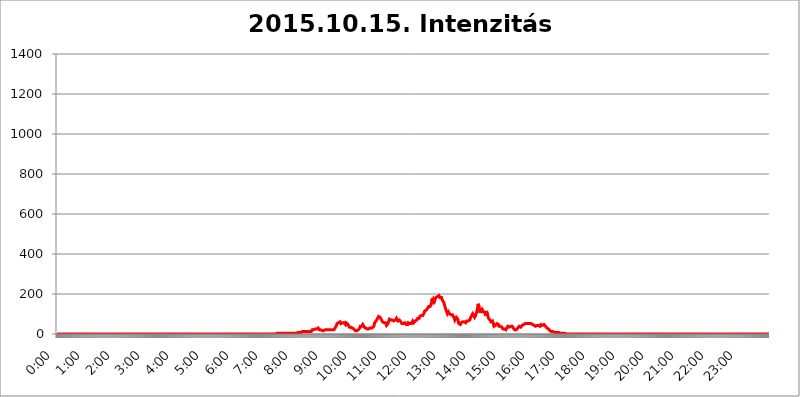
| Category | 2015.10.15. Intenzitás [W/m^2] |
|---|---|
| 0.0 | 0 |
| 0.0006944444444444445 | 0 |
| 0.001388888888888889 | 0 |
| 0.0020833333333333333 | 0 |
| 0.002777777777777778 | 0 |
| 0.003472222222222222 | 0 |
| 0.004166666666666667 | 0 |
| 0.004861111111111111 | 0 |
| 0.005555555555555556 | 0 |
| 0.0062499999999999995 | 0 |
| 0.006944444444444444 | 0 |
| 0.007638888888888889 | 0 |
| 0.008333333333333333 | 0 |
| 0.009027777777777779 | 0 |
| 0.009722222222222222 | 0 |
| 0.010416666666666666 | 0 |
| 0.011111111111111112 | 0 |
| 0.011805555555555555 | 0 |
| 0.012499999999999999 | 0 |
| 0.013194444444444444 | 0 |
| 0.013888888888888888 | 0 |
| 0.014583333333333332 | 0 |
| 0.015277777777777777 | 0 |
| 0.015972222222222224 | 0 |
| 0.016666666666666666 | 0 |
| 0.017361111111111112 | 0 |
| 0.018055555555555557 | 0 |
| 0.01875 | 0 |
| 0.019444444444444445 | 0 |
| 0.02013888888888889 | 0 |
| 0.020833333333333332 | 0 |
| 0.02152777777777778 | 0 |
| 0.022222222222222223 | 0 |
| 0.02291666666666667 | 0 |
| 0.02361111111111111 | 0 |
| 0.024305555555555556 | 0 |
| 0.024999999999999998 | 0 |
| 0.025694444444444447 | 0 |
| 0.02638888888888889 | 0 |
| 0.027083333333333334 | 0 |
| 0.027777777777777776 | 0 |
| 0.02847222222222222 | 0 |
| 0.029166666666666664 | 0 |
| 0.029861111111111113 | 0 |
| 0.030555555555555555 | 0 |
| 0.03125 | 0 |
| 0.03194444444444445 | 0 |
| 0.03263888888888889 | 0 |
| 0.03333333333333333 | 0 |
| 0.034027777777777775 | 0 |
| 0.034722222222222224 | 0 |
| 0.035416666666666666 | 0 |
| 0.036111111111111115 | 0 |
| 0.03680555555555556 | 0 |
| 0.0375 | 0 |
| 0.03819444444444444 | 0 |
| 0.03888888888888889 | 0 |
| 0.03958333333333333 | 0 |
| 0.04027777777777778 | 0 |
| 0.04097222222222222 | 0 |
| 0.041666666666666664 | 0 |
| 0.042361111111111106 | 0 |
| 0.04305555555555556 | 0 |
| 0.043750000000000004 | 0 |
| 0.044444444444444446 | 0 |
| 0.04513888888888889 | 0 |
| 0.04583333333333334 | 0 |
| 0.04652777777777778 | 0 |
| 0.04722222222222222 | 0 |
| 0.04791666666666666 | 0 |
| 0.04861111111111111 | 0 |
| 0.049305555555555554 | 0 |
| 0.049999999999999996 | 0 |
| 0.05069444444444445 | 0 |
| 0.051388888888888894 | 0 |
| 0.052083333333333336 | 0 |
| 0.05277777777777778 | 0 |
| 0.05347222222222222 | 0 |
| 0.05416666666666667 | 0 |
| 0.05486111111111111 | 0 |
| 0.05555555555555555 | 0 |
| 0.05625 | 0 |
| 0.05694444444444444 | 0 |
| 0.057638888888888885 | 0 |
| 0.05833333333333333 | 0 |
| 0.05902777777777778 | 0 |
| 0.059722222222222225 | 0 |
| 0.06041666666666667 | 0 |
| 0.061111111111111116 | 0 |
| 0.06180555555555556 | 0 |
| 0.0625 | 0 |
| 0.06319444444444444 | 0 |
| 0.06388888888888888 | 0 |
| 0.06458333333333334 | 0 |
| 0.06527777777777778 | 0 |
| 0.06597222222222222 | 0 |
| 0.06666666666666667 | 0 |
| 0.06736111111111111 | 0 |
| 0.06805555555555555 | 0 |
| 0.06874999999999999 | 0 |
| 0.06944444444444443 | 0 |
| 0.07013888888888889 | 0 |
| 0.07083333333333333 | 0 |
| 0.07152777777777779 | 0 |
| 0.07222222222222223 | 0 |
| 0.07291666666666667 | 0 |
| 0.07361111111111111 | 0 |
| 0.07430555555555556 | 0 |
| 0.075 | 0 |
| 0.07569444444444444 | 0 |
| 0.0763888888888889 | 0 |
| 0.07708333333333334 | 0 |
| 0.07777777777777778 | 0 |
| 0.07847222222222222 | 0 |
| 0.07916666666666666 | 0 |
| 0.0798611111111111 | 0 |
| 0.08055555555555556 | 0 |
| 0.08125 | 0 |
| 0.08194444444444444 | 0 |
| 0.08263888888888889 | 0 |
| 0.08333333333333333 | 0 |
| 0.08402777777777777 | 0 |
| 0.08472222222222221 | 0 |
| 0.08541666666666665 | 0 |
| 0.08611111111111112 | 0 |
| 0.08680555555555557 | 0 |
| 0.08750000000000001 | 0 |
| 0.08819444444444445 | 0 |
| 0.08888888888888889 | 0 |
| 0.08958333333333333 | 0 |
| 0.09027777777777778 | 0 |
| 0.09097222222222222 | 0 |
| 0.09166666666666667 | 0 |
| 0.09236111111111112 | 0 |
| 0.09305555555555556 | 0 |
| 0.09375 | 0 |
| 0.09444444444444444 | 0 |
| 0.09513888888888888 | 0 |
| 0.09583333333333333 | 0 |
| 0.09652777777777777 | 0 |
| 0.09722222222222222 | 0 |
| 0.09791666666666667 | 0 |
| 0.09861111111111111 | 0 |
| 0.09930555555555555 | 0 |
| 0.09999999999999999 | 0 |
| 0.10069444444444443 | 0 |
| 0.1013888888888889 | 0 |
| 0.10208333333333335 | 0 |
| 0.10277777777777779 | 0 |
| 0.10347222222222223 | 0 |
| 0.10416666666666667 | 0 |
| 0.10486111111111111 | 0 |
| 0.10555555555555556 | 0 |
| 0.10625 | 0 |
| 0.10694444444444444 | 0 |
| 0.1076388888888889 | 0 |
| 0.10833333333333334 | 0 |
| 0.10902777777777778 | 0 |
| 0.10972222222222222 | 0 |
| 0.1111111111111111 | 0 |
| 0.11180555555555556 | 0 |
| 0.11180555555555556 | 0 |
| 0.1125 | 0 |
| 0.11319444444444444 | 0 |
| 0.11388888888888889 | 0 |
| 0.11458333333333333 | 0 |
| 0.11527777777777777 | 0 |
| 0.11597222222222221 | 0 |
| 0.11666666666666665 | 0 |
| 0.1173611111111111 | 0 |
| 0.11805555555555557 | 0 |
| 0.11944444444444445 | 0 |
| 0.12013888888888889 | 0 |
| 0.12083333333333333 | 0 |
| 0.12152777777777778 | 0 |
| 0.12222222222222223 | 0 |
| 0.12291666666666667 | 0 |
| 0.12291666666666667 | 0 |
| 0.12361111111111112 | 0 |
| 0.12430555555555556 | 0 |
| 0.125 | 0 |
| 0.12569444444444444 | 0 |
| 0.12638888888888888 | 0 |
| 0.12708333333333333 | 0 |
| 0.16875 | 0 |
| 0.12847222222222224 | 0 |
| 0.12916666666666668 | 0 |
| 0.12986111111111112 | 0 |
| 0.13055555555555556 | 0 |
| 0.13125 | 0 |
| 0.13194444444444445 | 0 |
| 0.1326388888888889 | 0 |
| 0.13333333333333333 | 0 |
| 0.13402777777777777 | 0 |
| 0.13402777777777777 | 0 |
| 0.13472222222222222 | 0 |
| 0.13541666666666666 | 0 |
| 0.1361111111111111 | 0 |
| 0.13749999999999998 | 0 |
| 0.13819444444444443 | 0 |
| 0.1388888888888889 | 0 |
| 0.13958333333333334 | 0 |
| 0.14027777777777778 | 0 |
| 0.14097222222222222 | 0 |
| 0.14166666666666666 | 0 |
| 0.1423611111111111 | 0 |
| 0.14305555555555557 | 0 |
| 0.14375000000000002 | 0 |
| 0.14444444444444446 | 0 |
| 0.1451388888888889 | 0 |
| 0.1451388888888889 | 0 |
| 0.14652777777777778 | 0 |
| 0.14722222222222223 | 0 |
| 0.14791666666666667 | 0 |
| 0.1486111111111111 | 0 |
| 0.14930555555555555 | 0 |
| 0.15 | 0 |
| 0.15069444444444444 | 0 |
| 0.15138888888888888 | 0 |
| 0.15208333333333332 | 0 |
| 0.15277777777777776 | 0 |
| 0.15347222222222223 | 0 |
| 0.15416666666666667 | 0 |
| 0.15486111111111112 | 0 |
| 0.15555555555555556 | 0 |
| 0.15625 | 0 |
| 0.15694444444444444 | 0 |
| 0.15763888888888888 | 0 |
| 0.15833333333333333 | 0 |
| 0.15902777777777777 | 0 |
| 0.15972222222222224 | 0 |
| 0.16041666666666668 | 0 |
| 0.16111111111111112 | 0 |
| 0.16180555555555556 | 0 |
| 0.1625 | 0 |
| 0.16319444444444445 | 0 |
| 0.1638888888888889 | 0 |
| 0.16458333333333333 | 0 |
| 0.16527777777777777 | 0 |
| 0.16597222222222222 | 0 |
| 0.16666666666666666 | 0 |
| 0.1673611111111111 | 0 |
| 0.16805555555555554 | 0 |
| 0.16874999999999998 | 0 |
| 0.16944444444444443 | 0 |
| 0.17013888888888887 | 0 |
| 0.1708333333333333 | 0 |
| 0.17152777777777775 | 0 |
| 0.17222222222222225 | 0 |
| 0.1729166666666667 | 0 |
| 0.17361111111111113 | 0 |
| 0.17430555555555557 | 0 |
| 0.17500000000000002 | 0 |
| 0.17569444444444446 | 0 |
| 0.1763888888888889 | 0 |
| 0.17708333333333334 | 0 |
| 0.17777777777777778 | 0 |
| 0.17847222222222223 | 0 |
| 0.17916666666666667 | 0 |
| 0.1798611111111111 | 0 |
| 0.18055555555555555 | 0 |
| 0.18125 | 0 |
| 0.18194444444444444 | 0 |
| 0.1826388888888889 | 0 |
| 0.18333333333333335 | 0 |
| 0.1840277777777778 | 0 |
| 0.18472222222222223 | 0 |
| 0.18541666666666667 | 0 |
| 0.18611111111111112 | 0 |
| 0.18680555555555556 | 0 |
| 0.1875 | 0 |
| 0.18819444444444444 | 0 |
| 0.18888888888888888 | 0 |
| 0.18958333333333333 | 0 |
| 0.19027777777777777 | 0 |
| 0.1909722222222222 | 0 |
| 0.19166666666666665 | 0 |
| 0.19236111111111112 | 0 |
| 0.19305555555555554 | 0 |
| 0.19375 | 0 |
| 0.19444444444444445 | 0 |
| 0.1951388888888889 | 0 |
| 0.19583333333333333 | 0 |
| 0.19652777777777777 | 0 |
| 0.19722222222222222 | 0 |
| 0.19791666666666666 | 0 |
| 0.1986111111111111 | 0 |
| 0.19930555555555554 | 0 |
| 0.19999999999999998 | 0 |
| 0.20069444444444443 | 0 |
| 0.20138888888888887 | 0 |
| 0.2020833333333333 | 0 |
| 0.2027777777777778 | 0 |
| 0.2034722222222222 | 0 |
| 0.2041666666666667 | 0 |
| 0.20486111111111113 | 0 |
| 0.20555555555555557 | 0 |
| 0.20625000000000002 | 0 |
| 0.20694444444444446 | 0 |
| 0.2076388888888889 | 0 |
| 0.20833333333333334 | 0 |
| 0.20902777777777778 | 0 |
| 0.20972222222222223 | 0 |
| 0.21041666666666667 | 0 |
| 0.2111111111111111 | 0 |
| 0.21180555555555555 | 0 |
| 0.2125 | 0 |
| 0.21319444444444444 | 0 |
| 0.2138888888888889 | 0 |
| 0.21458333333333335 | 0 |
| 0.2152777777777778 | 0 |
| 0.21597222222222223 | 0 |
| 0.21666666666666667 | 0 |
| 0.21736111111111112 | 0 |
| 0.21805555555555556 | 0 |
| 0.21875 | 0 |
| 0.21944444444444444 | 0 |
| 0.22013888888888888 | 0 |
| 0.22083333333333333 | 0 |
| 0.22152777777777777 | 0 |
| 0.2222222222222222 | 0 |
| 0.22291666666666665 | 0 |
| 0.2236111111111111 | 0 |
| 0.22430555555555556 | 0 |
| 0.225 | 0 |
| 0.22569444444444445 | 0 |
| 0.2263888888888889 | 0 |
| 0.22708333333333333 | 0 |
| 0.22777777777777777 | 0 |
| 0.22847222222222222 | 0 |
| 0.22916666666666666 | 0 |
| 0.2298611111111111 | 0 |
| 0.23055555555555554 | 0 |
| 0.23124999999999998 | 0 |
| 0.23194444444444443 | 0 |
| 0.23263888888888887 | 0 |
| 0.2333333333333333 | 0 |
| 0.2340277777777778 | 0 |
| 0.2347222222222222 | 0 |
| 0.2354166666666667 | 0 |
| 0.23611111111111113 | 0 |
| 0.23680555555555557 | 0 |
| 0.23750000000000002 | 0 |
| 0.23819444444444446 | 0 |
| 0.2388888888888889 | 0 |
| 0.23958333333333334 | 0 |
| 0.24027777777777778 | 0 |
| 0.24097222222222223 | 0 |
| 0.24166666666666667 | 0 |
| 0.2423611111111111 | 0 |
| 0.24305555555555555 | 0 |
| 0.24375 | 0 |
| 0.24444444444444446 | 0 |
| 0.24513888888888888 | 0 |
| 0.24583333333333335 | 0 |
| 0.2465277777777778 | 0 |
| 0.24722222222222223 | 0 |
| 0.24791666666666667 | 0 |
| 0.24861111111111112 | 0 |
| 0.24930555555555556 | 0 |
| 0.25 | 0 |
| 0.25069444444444444 | 0 |
| 0.2513888888888889 | 0 |
| 0.2520833333333333 | 0 |
| 0.25277777777777777 | 0 |
| 0.2534722222222222 | 0 |
| 0.25416666666666665 | 0 |
| 0.2548611111111111 | 0 |
| 0.2555555555555556 | 0 |
| 0.25625000000000003 | 0 |
| 0.2569444444444445 | 0 |
| 0.2576388888888889 | 0 |
| 0.25833333333333336 | 0 |
| 0.2590277777777778 | 0 |
| 0.25972222222222224 | 0 |
| 0.2604166666666667 | 0 |
| 0.2611111111111111 | 0 |
| 0.26180555555555557 | 0 |
| 0.2625 | 0 |
| 0.26319444444444445 | 0 |
| 0.2638888888888889 | 0 |
| 0.26458333333333334 | 0 |
| 0.2652777777777778 | 0 |
| 0.2659722222222222 | 0 |
| 0.26666666666666666 | 0 |
| 0.2673611111111111 | 0 |
| 0.26805555555555555 | 0 |
| 0.26875 | 0 |
| 0.26944444444444443 | 0 |
| 0.2701388888888889 | 0 |
| 0.2708333333333333 | 0 |
| 0.27152777777777776 | 0 |
| 0.2722222222222222 | 0 |
| 0.27291666666666664 | 0 |
| 0.2736111111111111 | 0 |
| 0.2743055555555555 | 0 |
| 0.27499999999999997 | 0 |
| 0.27569444444444446 | 0 |
| 0.27638888888888885 | 0 |
| 0.27708333333333335 | 0 |
| 0.2777777777777778 | 0 |
| 0.27847222222222223 | 0 |
| 0.2791666666666667 | 0 |
| 0.2798611111111111 | 0 |
| 0.28055555555555556 | 0 |
| 0.28125 | 0 |
| 0.28194444444444444 | 0 |
| 0.2826388888888889 | 0 |
| 0.2833333333333333 | 0 |
| 0.28402777777777777 | 0 |
| 0.2847222222222222 | 0 |
| 0.28541666666666665 | 0 |
| 0.28611111111111115 | 0 |
| 0.28680555555555554 | 0 |
| 0.28750000000000003 | 0 |
| 0.2881944444444445 | 0 |
| 0.2888888888888889 | 0 |
| 0.28958333333333336 | 0 |
| 0.2902777777777778 | 0 |
| 0.29097222222222224 | 0 |
| 0.2916666666666667 | 0 |
| 0.2923611111111111 | 0 |
| 0.29305555555555557 | 0 |
| 0.29375 | 0 |
| 0.29444444444444445 | 0 |
| 0.2951388888888889 | 0 |
| 0.29583333333333334 | 0 |
| 0.2965277777777778 | 0 |
| 0.2972222222222222 | 0 |
| 0.29791666666666666 | 0 |
| 0.2986111111111111 | 0 |
| 0.29930555555555555 | 0 |
| 0.3 | 0 |
| 0.30069444444444443 | 0 |
| 0.3013888888888889 | 0 |
| 0.3020833333333333 | 0 |
| 0.30277777777777776 | 0 |
| 0.3034722222222222 | 0 |
| 0.30416666666666664 | 0 |
| 0.3048611111111111 | 0 |
| 0.3055555555555555 | 0 |
| 0.30624999999999997 | 0 |
| 0.3069444444444444 | 0 |
| 0.3076388888888889 | 0 |
| 0.30833333333333335 | 3.525 |
| 0.3090277777777778 | 3.525 |
| 0.30972222222222223 | 3.525 |
| 0.3104166666666667 | 3.525 |
| 0.3111111111111111 | 3.525 |
| 0.31180555555555556 | 3.525 |
| 0.3125 | 3.525 |
| 0.31319444444444444 | 3.525 |
| 0.3138888888888889 | 3.525 |
| 0.3145833333333333 | 3.525 |
| 0.31527777777777777 | 3.525 |
| 0.3159722222222222 | 3.525 |
| 0.31666666666666665 | 3.525 |
| 0.31736111111111115 | 3.525 |
| 0.31805555555555554 | 3.525 |
| 0.31875000000000003 | 3.525 |
| 0.3194444444444445 | 3.525 |
| 0.3201388888888889 | 3.525 |
| 0.32083333333333336 | 3.525 |
| 0.3215277777777778 | 3.525 |
| 0.32222222222222224 | 3.525 |
| 0.3229166666666667 | 3.525 |
| 0.3236111111111111 | 3.525 |
| 0.32430555555555557 | 3.525 |
| 0.325 | 3.525 |
| 0.32569444444444445 | 3.525 |
| 0.3263888888888889 | 3.525 |
| 0.32708333333333334 | 3.525 |
| 0.3277777777777778 | 3.525 |
| 0.3284722222222222 | 3.525 |
| 0.32916666666666666 | 3.525 |
| 0.3298611111111111 | 3.525 |
| 0.33055555555555555 | 3.525 |
| 0.33125 | 3.525 |
| 0.33194444444444443 | 3.525 |
| 0.3326388888888889 | 3.525 |
| 0.3333333333333333 | 3.525 |
| 0.3340277777777778 | 3.525 |
| 0.3347222222222222 | 3.525 |
| 0.3354166666666667 | 3.525 |
| 0.3361111111111111 | 3.525 |
| 0.3368055555555556 | 7.887 |
| 0.33749999999999997 | 7.887 |
| 0.33819444444444446 | 7.887 |
| 0.33888888888888885 | 7.887 |
| 0.33958333333333335 | 7.887 |
| 0.34027777777777773 | 7.887 |
| 0.34097222222222223 | 7.887 |
| 0.3416666666666666 | 7.887 |
| 0.3423611111111111 | 7.887 |
| 0.3430555555555555 | 7.887 |
| 0.34375 | 12.257 |
| 0.3444444444444445 | 12.257 |
| 0.3451388888888889 | 12.257 |
| 0.3458333333333334 | 12.257 |
| 0.34652777777777777 | 12.257 |
| 0.34722222222222227 | 12.257 |
| 0.34791666666666665 | 12.257 |
| 0.34861111111111115 | 12.257 |
| 0.34930555555555554 | 12.257 |
| 0.35000000000000003 | 12.257 |
| 0.3506944444444444 | 12.257 |
| 0.3513888888888889 | 12.257 |
| 0.3520833333333333 | 12.257 |
| 0.3527777777777778 | 12.257 |
| 0.3534722222222222 | 12.257 |
| 0.3541666666666667 | 12.257 |
| 0.3548611111111111 | 12.257 |
| 0.35555555555555557 | 12.257 |
| 0.35625 | 12.257 |
| 0.35694444444444445 | 16.636 |
| 0.3576388888888889 | 21.024 |
| 0.35833333333333334 | 21.024 |
| 0.3590277777777778 | 21.024 |
| 0.3597222222222222 | 21.024 |
| 0.36041666666666666 | 21.024 |
| 0.3611111111111111 | 25.419 |
| 0.36180555555555555 | 25.419 |
| 0.3625 | 25.419 |
| 0.36319444444444443 | 25.419 |
| 0.3638888888888889 | 25.419 |
| 0.3645833333333333 | 25.419 |
| 0.3652777777777778 | 29.823 |
| 0.3659722222222222 | 29.823 |
| 0.3666666666666667 | 25.419 |
| 0.3673611111111111 | 21.024 |
| 0.3680555555555556 | 21.024 |
| 0.36874999999999997 | 21.024 |
| 0.36944444444444446 | 21.024 |
| 0.37013888888888885 | 21.024 |
| 0.37083333333333335 | 16.636 |
| 0.37152777777777773 | 16.636 |
| 0.37222222222222223 | 16.636 |
| 0.3729166666666666 | 16.636 |
| 0.3736111111111111 | 16.636 |
| 0.3743055555555555 | 21.024 |
| 0.375 | 21.024 |
| 0.3756944444444445 | 21.024 |
| 0.3763888888888889 | 21.024 |
| 0.3770833333333334 | 21.024 |
| 0.37777777777777777 | 21.024 |
| 0.37847222222222227 | 21.024 |
| 0.37916666666666665 | 21.024 |
| 0.37986111111111115 | 21.024 |
| 0.38055555555555554 | 21.024 |
| 0.38125000000000003 | 21.024 |
| 0.3819444444444444 | 21.024 |
| 0.3826388888888889 | 21.024 |
| 0.3833333333333333 | 21.024 |
| 0.3840277777777778 | 21.024 |
| 0.3847222222222222 | 21.024 |
| 0.3854166666666667 | 21.024 |
| 0.3861111111111111 | 21.024 |
| 0.38680555555555557 | 21.024 |
| 0.3875 | 21.024 |
| 0.38819444444444445 | 21.024 |
| 0.3888888888888889 | 25.419 |
| 0.38958333333333334 | 29.823 |
| 0.3902777777777778 | 29.823 |
| 0.3909722222222222 | 34.234 |
| 0.39166666666666666 | 43.079 |
| 0.3923611111111111 | 51.951 |
| 0.39305555555555555 | 56.398 |
| 0.39375 | 56.398 |
| 0.39444444444444443 | 56.398 |
| 0.3951388888888889 | 56.398 |
| 0.3958333333333333 | 56.398 |
| 0.3965277777777778 | 60.85 |
| 0.3972222222222222 | 56.398 |
| 0.3979166666666667 | 51.951 |
| 0.3986111111111111 | 56.398 |
| 0.3993055555555556 | 56.398 |
| 0.39999999999999997 | 56.398 |
| 0.40069444444444446 | 51.951 |
| 0.40138888888888885 | 56.398 |
| 0.40208333333333335 | 56.398 |
| 0.40277777777777773 | 60.85 |
| 0.40347222222222223 | 51.951 |
| 0.4041666666666666 | 47.511 |
| 0.4048611111111111 | 56.398 |
| 0.4055555555555555 | 56.398 |
| 0.40625 | 51.951 |
| 0.4069444444444445 | 51.951 |
| 0.4076388888888889 | 47.511 |
| 0.4083333333333334 | 43.079 |
| 0.40902777777777777 | 38.653 |
| 0.40972222222222227 | 34.234 |
| 0.41041666666666665 | 34.234 |
| 0.41111111111111115 | 38.653 |
| 0.41180555555555554 | 34.234 |
| 0.41250000000000003 | 34.234 |
| 0.4131944444444444 | 29.823 |
| 0.4138888888888889 | 29.823 |
| 0.4145833333333333 | 25.419 |
| 0.4152777777777778 | 25.419 |
| 0.4159722222222222 | 25.419 |
| 0.4166666666666667 | 25.419 |
| 0.4173611111111111 | 21.024 |
| 0.41805555555555557 | 16.636 |
| 0.41875 | 16.636 |
| 0.41944444444444445 | 16.636 |
| 0.4201388888888889 | 16.636 |
| 0.42083333333333334 | 16.636 |
| 0.4215277777777778 | 16.636 |
| 0.4222222222222222 | 21.024 |
| 0.42291666666666666 | 21.024 |
| 0.4236111111111111 | 25.419 |
| 0.42430555555555555 | 29.823 |
| 0.425 | 38.653 |
| 0.42569444444444443 | 43.079 |
| 0.4263888888888889 | 38.653 |
| 0.4270833333333333 | 38.653 |
| 0.4277777777777778 | 43.079 |
| 0.4284722222222222 | 47.511 |
| 0.4291666666666667 | 47.511 |
| 0.4298611111111111 | 43.079 |
| 0.4305555555555556 | 34.234 |
| 0.43124999999999997 | 29.823 |
| 0.43194444444444446 | 29.823 |
| 0.43263888888888885 | 29.823 |
| 0.43333333333333335 | 29.823 |
| 0.43402777777777773 | 25.419 |
| 0.43472222222222223 | 25.419 |
| 0.4354166666666666 | 25.419 |
| 0.4361111111111111 | 25.419 |
| 0.4368055555555555 | 25.419 |
| 0.4375 | 29.823 |
| 0.4381944444444445 | 29.823 |
| 0.4388888888888889 | 29.823 |
| 0.4395833333333334 | 29.823 |
| 0.44027777777777777 | 29.823 |
| 0.44097222222222227 | 29.823 |
| 0.44166666666666665 | 29.823 |
| 0.44236111111111115 | 34.234 |
| 0.44305555555555554 | 34.234 |
| 0.44375000000000003 | 38.653 |
| 0.4444444444444444 | 43.079 |
| 0.4451388888888889 | 56.398 |
| 0.4458333333333333 | 56.398 |
| 0.4465277777777778 | 56.398 |
| 0.4472222222222222 | 65.31 |
| 0.4479166666666667 | 69.775 |
| 0.4486111111111111 | 74.246 |
| 0.44930555555555557 | 74.246 |
| 0.45 | 78.722 |
| 0.45069444444444445 | 87.692 |
| 0.4513888888888889 | 83.205 |
| 0.45208333333333334 | 83.205 |
| 0.4527777777777778 | 83.205 |
| 0.4534722222222222 | 83.205 |
| 0.45416666666666666 | 74.246 |
| 0.4548611111111111 | 74.246 |
| 0.45555555555555555 | 69.775 |
| 0.45625 | 60.85 |
| 0.45694444444444443 | 56.398 |
| 0.4576388888888889 | 56.398 |
| 0.4583333333333333 | 56.398 |
| 0.4590277777777778 | 51.951 |
| 0.4597222222222222 | 51.951 |
| 0.4604166666666667 | 56.398 |
| 0.4611111111111111 | 51.951 |
| 0.4618055555555556 | 43.079 |
| 0.46249999999999997 | 47.511 |
| 0.46319444444444446 | 47.511 |
| 0.46388888888888885 | 51.951 |
| 0.46458333333333335 | 60.85 |
| 0.46527777777777773 | 65.31 |
| 0.46597222222222223 | 74.246 |
| 0.4666666666666666 | 74.246 |
| 0.4673611111111111 | 74.246 |
| 0.4680555555555555 | 69.775 |
| 0.46875 | 69.775 |
| 0.4694444444444445 | 65.31 |
| 0.4701388888888889 | 69.775 |
| 0.4708333333333334 | 69.775 |
| 0.47152777777777777 | 69.775 |
| 0.47222222222222227 | 65.31 |
| 0.47291666666666665 | 65.31 |
| 0.47361111111111115 | 65.31 |
| 0.47430555555555554 | 69.775 |
| 0.47500000000000003 | 74.246 |
| 0.4756944444444444 | 78.722 |
| 0.4763888888888889 | 78.722 |
| 0.4770833333333333 | 74.246 |
| 0.4777777777777778 | 65.31 |
| 0.4784722222222222 | 65.31 |
| 0.4791666666666667 | 69.775 |
| 0.4798611111111111 | 69.775 |
| 0.48055555555555557 | 65.31 |
| 0.48125 | 65.31 |
| 0.48194444444444445 | 60.85 |
| 0.4826388888888889 | 56.398 |
| 0.48333333333333334 | 51.951 |
| 0.4840277777777778 | 51.951 |
| 0.4847222222222222 | 56.398 |
| 0.48541666666666666 | 51.951 |
| 0.4861111111111111 | 51.951 |
| 0.48680555555555555 | 56.398 |
| 0.4875 | 56.398 |
| 0.48819444444444443 | 60.85 |
| 0.4888888888888889 | 56.398 |
| 0.4895833333333333 | 47.511 |
| 0.4902777777777778 | 47.511 |
| 0.4909722222222222 | 47.511 |
| 0.4916666666666667 | 47.511 |
| 0.4923611111111111 | 56.398 |
| 0.4930555555555556 | 60.85 |
| 0.49374999999999997 | 56.398 |
| 0.49444444444444446 | 51.951 |
| 0.49513888888888885 | 47.511 |
| 0.49583333333333335 | 47.511 |
| 0.49652777777777773 | 51.951 |
| 0.49722222222222223 | 56.398 |
| 0.4979166666666666 | 56.398 |
| 0.4986111111111111 | 65.31 |
| 0.4993055555555555 | 60.85 |
| 0.5 | 56.398 |
| 0.5006944444444444 | 60.85 |
| 0.5013888888888889 | 60.85 |
| 0.5020833333333333 | 65.31 |
| 0.5027777777777778 | 65.31 |
| 0.5034722222222222 | 65.31 |
| 0.5041666666666667 | 69.775 |
| 0.5048611111111111 | 74.246 |
| 0.5055555555555555 | 78.722 |
| 0.50625 | 74.246 |
| 0.5069444444444444 | 74.246 |
| 0.5076388888888889 | 78.722 |
| 0.5083333333333333 | 87.692 |
| 0.5090277777777777 | 87.692 |
| 0.5097222222222222 | 87.692 |
| 0.5104166666666666 | 92.184 |
| 0.5111111111111112 | 96.682 |
| 0.5118055555555555 | 92.184 |
| 0.5125000000000001 | 92.184 |
| 0.5131944444444444 | 87.692 |
| 0.513888888888889 | 96.682 |
| 0.5145833333333333 | 105.69 |
| 0.5152777777777778 | 114.716 |
| 0.5159722222222222 | 114.716 |
| 0.5166666666666667 | 119.235 |
| 0.517361111111111 | 119.235 |
| 0.5180555555555556 | 123.758 |
| 0.5187499999999999 | 123.758 |
| 0.5194444444444445 | 128.284 |
| 0.5201388888888888 | 132.814 |
| 0.5208333333333334 | 137.347 |
| 0.5215277777777778 | 137.347 |
| 0.5222222222222223 | 137.347 |
| 0.5229166666666667 | 137.347 |
| 0.5236111111111111 | 137.347 |
| 0.5243055555555556 | 137.347 |
| 0.525 | 155.509 |
| 0.5256944444444445 | 178.264 |
| 0.5263888888888889 | 173.709 |
| 0.5270833333333333 | 164.605 |
| 0.5277777777777778 | 173.709 |
| 0.5284722222222222 | 169.156 |
| 0.5291666666666667 | 164.605 |
| 0.5298611111111111 | 173.709 |
| 0.5305555555555556 | 178.264 |
| 0.53125 | 182.82 |
| 0.5319444444444444 | 182.82 |
| 0.5326388888888889 | 187.378 |
| 0.5333333333333333 | 187.378 |
| 0.5340277777777778 | 191.937 |
| 0.5347222222222222 | 191.937 |
| 0.5354166666666667 | 191.937 |
| 0.5361111111111111 | 191.937 |
| 0.5368055555555555 | 182.82 |
| 0.5375 | 187.378 |
| 0.5381944444444444 | 182.82 |
| 0.5388888888888889 | 182.82 |
| 0.5395833333333333 | 173.709 |
| 0.5402777777777777 | 173.709 |
| 0.5409722222222222 | 164.605 |
| 0.5416666666666666 | 160.056 |
| 0.5423611111111112 | 155.509 |
| 0.5430555555555555 | 146.423 |
| 0.5437500000000001 | 137.347 |
| 0.5444444444444444 | 128.284 |
| 0.545138888888889 | 123.758 |
| 0.5458333333333333 | 114.716 |
| 0.5465277777777778 | 114.716 |
| 0.5472222222222222 | 101.184 |
| 0.5479166666666667 | 105.69 |
| 0.548611111111111 | 110.201 |
| 0.5493055555555556 | 105.69 |
| 0.5499999999999999 | 101.184 |
| 0.5506944444444445 | 101.184 |
| 0.5513888888888888 | 101.184 |
| 0.5520833333333334 | 96.682 |
| 0.5527777777777778 | 92.184 |
| 0.5534722222222223 | 96.682 |
| 0.5541666666666667 | 96.682 |
| 0.5548611111111111 | 96.682 |
| 0.5555555555555556 | 87.692 |
| 0.55625 | 83.205 |
| 0.5569444444444445 | 78.722 |
| 0.5576388888888889 | 69.775 |
| 0.5583333333333333 | 65.31 |
| 0.5590277777777778 | 69.775 |
| 0.5597222222222222 | 83.205 |
| 0.5604166666666667 | 87.692 |
| 0.5611111111111111 | 83.205 |
| 0.5618055555555556 | 74.246 |
| 0.5625 | 60.85 |
| 0.5631944444444444 | 51.951 |
| 0.5638888888888889 | 51.951 |
| 0.5645833333333333 | 47.511 |
| 0.5652777777777778 | 47.511 |
| 0.5659722222222222 | 51.951 |
| 0.5666666666666667 | 56.398 |
| 0.5673611111111111 | 60.85 |
| 0.5680555555555555 | 60.85 |
| 0.56875 | 60.85 |
| 0.5694444444444444 | 65.31 |
| 0.5701388888888889 | 60.85 |
| 0.5708333333333333 | 60.85 |
| 0.5715277777777777 | 56.398 |
| 0.5722222222222222 | 56.398 |
| 0.5729166666666666 | 56.398 |
| 0.5736111111111112 | 60.85 |
| 0.5743055555555555 | 65.31 |
| 0.5750000000000001 | 60.85 |
| 0.5756944444444444 | 65.31 |
| 0.576388888888889 | 65.31 |
| 0.5770833333333333 | 60.85 |
| 0.5777777777777778 | 60.85 |
| 0.5784722222222222 | 69.775 |
| 0.5791666666666667 | 74.246 |
| 0.579861111111111 | 83.205 |
| 0.5805555555555556 | 83.205 |
| 0.5812499999999999 | 92.184 |
| 0.5819444444444445 | 96.682 |
| 0.5826388888888888 | 101.184 |
| 0.5833333333333334 | 96.682 |
| 0.5840277777777778 | 92.184 |
| 0.5847222222222223 | 87.692 |
| 0.5854166666666667 | 83.205 |
| 0.5861111111111111 | 87.692 |
| 0.5868055555555556 | 92.184 |
| 0.5875 | 101.184 |
| 0.5881944444444445 | 110.201 |
| 0.5888888888888889 | 119.235 |
| 0.5895833333333333 | 132.814 |
| 0.5902777777777778 | 150.964 |
| 0.5909722222222222 | 155.509 |
| 0.5916666666666667 | 137.347 |
| 0.5923611111111111 | 114.716 |
| 0.5930555555555556 | 105.69 |
| 0.59375 | 119.235 |
| 0.5944444444444444 | 128.284 |
| 0.5951388888888889 | 114.716 |
| 0.5958333333333333 | 105.69 |
| 0.5965277777777778 | 119.235 |
| 0.5972222222222222 | 114.716 |
| 0.5979166666666667 | 110.201 |
| 0.5986111111111111 | 110.201 |
| 0.5993055555555555 | 110.201 |
| 0.6 | 105.69 |
| 0.6006944444444444 | 92.184 |
| 0.6013888888888889 | 96.682 |
| 0.6020833333333333 | 114.716 |
| 0.6027777777777777 | 114.716 |
| 0.6034722222222222 | 96.682 |
| 0.6041666666666666 | 87.692 |
| 0.6048611111111112 | 78.722 |
| 0.6055555555555555 | 74.246 |
| 0.6062500000000001 | 74.246 |
| 0.6069444444444444 | 69.775 |
| 0.607638888888889 | 65.31 |
| 0.6083333333333333 | 60.85 |
| 0.6090277777777778 | 65.31 |
| 0.6097222222222222 | 65.31 |
| 0.6104166666666667 | 65.31 |
| 0.611111111111111 | 60.85 |
| 0.6118055555555556 | 51.951 |
| 0.6124999999999999 | 38.653 |
| 0.6131944444444445 | 38.653 |
| 0.6138888888888888 | 38.653 |
| 0.6145833333333334 | 43.079 |
| 0.6152777777777778 | 43.079 |
| 0.6159722222222223 | 47.511 |
| 0.6166666666666667 | 51.951 |
| 0.6173611111111111 | 47.511 |
| 0.6180555555555556 | 47.511 |
| 0.61875 | 47.511 |
| 0.6194444444444445 | 38.653 |
| 0.6201388888888889 | 38.653 |
| 0.6208333333333333 | 38.653 |
| 0.6215277777777778 | 38.653 |
| 0.6222222222222222 | 34.234 |
| 0.6229166666666667 | 34.234 |
| 0.6236111111111111 | 34.234 |
| 0.6243055555555556 | 29.823 |
| 0.625 | 25.419 |
| 0.6256944444444444 | 25.419 |
| 0.6263888888888889 | 29.823 |
| 0.6270833333333333 | 25.419 |
| 0.6277777777777778 | 25.419 |
| 0.6284722222222222 | 21.024 |
| 0.6291666666666667 | 21.024 |
| 0.6298611111111111 | 25.419 |
| 0.6305555555555555 | 29.823 |
| 0.63125 | 34.234 |
| 0.6319444444444444 | 38.653 |
| 0.6326388888888889 | 38.653 |
| 0.6333333333333333 | 34.234 |
| 0.6340277777777777 | 34.234 |
| 0.6347222222222222 | 34.234 |
| 0.6354166666666666 | 34.234 |
| 0.6361111111111112 | 38.653 |
| 0.6368055555555555 | 38.653 |
| 0.6375000000000001 | 38.653 |
| 0.6381944444444444 | 38.653 |
| 0.638888888888889 | 34.234 |
| 0.6395833333333333 | 29.823 |
| 0.6402777777777778 | 29.823 |
| 0.6409722222222222 | 25.419 |
| 0.6416666666666667 | 21.024 |
| 0.642361111111111 | 21.024 |
| 0.6430555555555556 | 21.024 |
| 0.6437499999999999 | 21.024 |
| 0.6444444444444445 | 25.419 |
| 0.6451388888888888 | 25.419 |
| 0.6458333333333334 | 29.823 |
| 0.6465277777777778 | 34.234 |
| 0.6472222222222223 | 34.234 |
| 0.6479166666666667 | 38.653 |
| 0.6486111111111111 | 38.653 |
| 0.6493055555555556 | 34.234 |
| 0.65 | 34.234 |
| 0.6506944444444445 | 34.234 |
| 0.6513888888888889 | 38.653 |
| 0.6520833333333333 | 43.079 |
| 0.6527777777777778 | 43.079 |
| 0.6534722222222222 | 43.079 |
| 0.6541666666666667 | 47.511 |
| 0.6548611111111111 | 47.511 |
| 0.6555555555555556 | 47.511 |
| 0.65625 | 51.951 |
| 0.6569444444444444 | 51.951 |
| 0.6576388888888889 | 47.511 |
| 0.6583333333333333 | 51.951 |
| 0.6590277777777778 | 51.951 |
| 0.6597222222222222 | 51.951 |
| 0.6604166666666667 | 51.951 |
| 0.6611111111111111 | 47.511 |
| 0.6618055555555555 | 51.951 |
| 0.6625 | 51.951 |
| 0.6631944444444444 | 51.951 |
| 0.6638888888888889 | 47.511 |
| 0.6645833333333333 | 51.951 |
| 0.6652777777777777 | 51.951 |
| 0.6659722222222222 | 47.511 |
| 0.6666666666666666 | 47.511 |
| 0.6673611111111111 | 43.079 |
| 0.6680555555555556 | 43.079 |
| 0.6687500000000001 | 43.079 |
| 0.6694444444444444 | 38.653 |
| 0.6701388888888888 | 38.653 |
| 0.6708333333333334 | 38.653 |
| 0.6715277777777778 | 43.079 |
| 0.6722222222222222 | 43.079 |
| 0.6729166666666666 | 43.079 |
| 0.6736111111111112 | 43.079 |
| 0.6743055555555556 | 43.079 |
| 0.6749999999999999 | 43.079 |
| 0.6756944444444444 | 43.079 |
| 0.6763888888888889 | 43.079 |
| 0.6770833333333334 | 38.653 |
| 0.6777777777777777 | 38.653 |
| 0.6784722222222223 | 47.511 |
| 0.6791666666666667 | 47.511 |
| 0.6798611111111111 | 47.511 |
| 0.6805555555555555 | 43.079 |
| 0.68125 | 43.079 |
| 0.6819444444444445 | 43.079 |
| 0.6826388888888889 | 47.511 |
| 0.6833333333333332 | 47.511 |
| 0.6840277777777778 | 43.079 |
| 0.6847222222222222 | 38.653 |
| 0.6854166666666667 | 38.653 |
| 0.686111111111111 | 34.234 |
| 0.6868055555555556 | 29.823 |
| 0.6875 | 29.823 |
| 0.6881944444444444 | 25.419 |
| 0.688888888888889 | 25.419 |
| 0.6895833333333333 | 21.024 |
| 0.6902777777777778 | 21.024 |
| 0.6909722222222222 | 16.636 |
| 0.6916666666666668 | 16.636 |
| 0.6923611111111111 | 12.257 |
| 0.6930555555555555 | 12.257 |
| 0.69375 | 12.257 |
| 0.6944444444444445 | 12.257 |
| 0.6951388888888889 | 12.257 |
| 0.6958333333333333 | 12.257 |
| 0.6965277777777777 | 7.887 |
| 0.6972222222222223 | 7.887 |
| 0.6979166666666666 | 7.887 |
| 0.6986111111111111 | 7.887 |
| 0.6993055555555556 | 7.887 |
| 0.7000000000000001 | 7.887 |
| 0.7006944444444444 | 7.887 |
| 0.7013888888888888 | 7.887 |
| 0.7020833333333334 | 7.887 |
| 0.7027777777777778 | 7.887 |
| 0.7034722222222222 | 7.887 |
| 0.7041666666666666 | 3.525 |
| 0.7048611111111112 | 3.525 |
| 0.7055555555555556 | 3.525 |
| 0.7062499999999999 | 3.525 |
| 0.7069444444444444 | 3.525 |
| 0.7076388888888889 | 3.525 |
| 0.7083333333333334 | 3.525 |
| 0.7090277777777777 | 3.525 |
| 0.7097222222222223 | 3.525 |
| 0.7104166666666667 | 3.525 |
| 0.7111111111111111 | 3.525 |
| 0.7118055555555555 | 3.525 |
| 0.7125 | 3.525 |
| 0.7131944444444445 | 0 |
| 0.7138888888888889 | 0 |
| 0.7145833333333332 | 0 |
| 0.7152777777777778 | 0 |
| 0.7159722222222222 | 0 |
| 0.7166666666666667 | 0 |
| 0.717361111111111 | 0 |
| 0.7180555555555556 | 0 |
| 0.71875 | 0 |
| 0.7194444444444444 | 0 |
| 0.720138888888889 | 0 |
| 0.7208333333333333 | 0 |
| 0.7215277777777778 | 0 |
| 0.7222222222222222 | 0 |
| 0.7229166666666668 | 0 |
| 0.7236111111111111 | 0 |
| 0.7243055555555555 | 0 |
| 0.725 | 0 |
| 0.7256944444444445 | 0 |
| 0.7263888888888889 | 0 |
| 0.7270833333333333 | 0 |
| 0.7277777777777777 | 0 |
| 0.7284722222222223 | 0 |
| 0.7291666666666666 | 0 |
| 0.7298611111111111 | 0 |
| 0.7305555555555556 | 0 |
| 0.7312500000000001 | 0 |
| 0.7319444444444444 | 0 |
| 0.7326388888888888 | 0 |
| 0.7333333333333334 | 0 |
| 0.7340277777777778 | 0 |
| 0.7347222222222222 | 0 |
| 0.7354166666666666 | 0 |
| 0.7361111111111112 | 0 |
| 0.7368055555555556 | 0 |
| 0.7374999999999999 | 0 |
| 0.7381944444444444 | 0 |
| 0.7388888888888889 | 0 |
| 0.7395833333333334 | 0 |
| 0.7402777777777777 | 0 |
| 0.7409722222222223 | 0 |
| 0.7416666666666667 | 0 |
| 0.7423611111111111 | 0 |
| 0.7430555555555555 | 0 |
| 0.74375 | 0 |
| 0.7444444444444445 | 0 |
| 0.7451388888888889 | 0 |
| 0.7458333333333332 | 0 |
| 0.7465277777777778 | 0 |
| 0.7472222222222222 | 0 |
| 0.7479166666666667 | 0 |
| 0.748611111111111 | 0 |
| 0.7493055555555556 | 0 |
| 0.75 | 0 |
| 0.7506944444444444 | 0 |
| 0.751388888888889 | 0 |
| 0.7520833333333333 | 0 |
| 0.7527777777777778 | 0 |
| 0.7534722222222222 | 0 |
| 0.7541666666666668 | 0 |
| 0.7548611111111111 | 0 |
| 0.7555555555555555 | 0 |
| 0.75625 | 0 |
| 0.7569444444444445 | 0 |
| 0.7576388888888889 | 0 |
| 0.7583333333333333 | 0 |
| 0.7590277777777777 | 0 |
| 0.7597222222222223 | 0 |
| 0.7604166666666666 | 0 |
| 0.7611111111111111 | 0 |
| 0.7618055555555556 | 0 |
| 0.7625000000000001 | 0 |
| 0.7631944444444444 | 0 |
| 0.7638888888888888 | 0 |
| 0.7645833333333334 | 0 |
| 0.7652777777777778 | 0 |
| 0.7659722222222222 | 0 |
| 0.7666666666666666 | 0 |
| 0.7673611111111112 | 0 |
| 0.7680555555555556 | 0 |
| 0.7687499999999999 | 0 |
| 0.7694444444444444 | 0 |
| 0.7701388888888889 | 0 |
| 0.7708333333333334 | 0 |
| 0.7715277777777777 | 0 |
| 0.7722222222222223 | 0 |
| 0.7729166666666667 | 0 |
| 0.7736111111111111 | 0 |
| 0.7743055555555555 | 0 |
| 0.775 | 0 |
| 0.7756944444444445 | 0 |
| 0.7763888888888889 | 0 |
| 0.7770833333333332 | 0 |
| 0.7777777777777778 | 0 |
| 0.7784722222222222 | 0 |
| 0.7791666666666667 | 0 |
| 0.779861111111111 | 0 |
| 0.7805555555555556 | 0 |
| 0.78125 | 0 |
| 0.7819444444444444 | 0 |
| 0.782638888888889 | 0 |
| 0.7833333333333333 | 0 |
| 0.7840277777777778 | 0 |
| 0.7847222222222222 | 0 |
| 0.7854166666666668 | 0 |
| 0.7861111111111111 | 0 |
| 0.7868055555555555 | 0 |
| 0.7875 | 0 |
| 0.7881944444444445 | 0 |
| 0.7888888888888889 | 0 |
| 0.7895833333333333 | 0 |
| 0.7902777777777777 | 0 |
| 0.7909722222222223 | 0 |
| 0.7916666666666666 | 0 |
| 0.7923611111111111 | 0 |
| 0.7930555555555556 | 0 |
| 0.7937500000000001 | 0 |
| 0.7944444444444444 | 0 |
| 0.7951388888888888 | 0 |
| 0.7958333333333334 | 0 |
| 0.7965277777777778 | 0 |
| 0.7972222222222222 | 0 |
| 0.7979166666666666 | 0 |
| 0.7986111111111112 | 0 |
| 0.7993055555555556 | 0 |
| 0.7999999999999999 | 0 |
| 0.8006944444444444 | 0 |
| 0.8013888888888889 | 0 |
| 0.8020833333333334 | 0 |
| 0.8027777777777777 | 0 |
| 0.8034722222222223 | 0 |
| 0.8041666666666667 | 0 |
| 0.8048611111111111 | 0 |
| 0.8055555555555555 | 0 |
| 0.80625 | 0 |
| 0.8069444444444445 | 0 |
| 0.8076388888888889 | 0 |
| 0.8083333333333332 | 0 |
| 0.8090277777777778 | 0 |
| 0.8097222222222222 | 0 |
| 0.8104166666666667 | 0 |
| 0.811111111111111 | 0 |
| 0.8118055555555556 | 0 |
| 0.8125 | 0 |
| 0.8131944444444444 | 0 |
| 0.813888888888889 | 0 |
| 0.8145833333333333 | 0 |
| 0.8152777777777778 | 0 |
| 0.8159722222222222 | 0 |
| 0.8166666666666668 | 0 |
| 0.8173611111111111 | 0 |
| 0.8180555555555555 | 0 |
| 0.81875 | 0 |
| 0.8194444444444445 | 0 |
| 0.8201388888888889 | 0 |
| 0.8208333333333333 | 0 |
| 0.8215277777777777 | 0 |
| 0.8222222222222223 | 0 |
| 0.8229166666666666 | 0 |
| 0.8236111111111111 | 0 |
| 0.8243055555555556 | 0 |
| 0.8250000000000001 | 0 |
| 0.8256944444444444 | 0 |
| 0.8263888888888888 | 0 |
| 0.8270833333333334 | 0 |
| 0.8277777777777778 | 0 |
| 0.8284722222222222 | 0 |
| 0.8291666666666666 | 0 |
| 0.8298611111111112 | 0 |
| 0.8305555555555556 | 0 |
| 0.8312499999999999 | 0 |
| 0.8319444444444444 | 0 |
| 0.8326388888888889 | 0 |
| 0.8333333333333334 | 0 |
| 0.8340277777777777 | 0 |
| 0.8347222222222223 | 0 |
| 0.8354166666666667 | 0 |
| 0.8361111111111111 | 0 |
| 0.8368055555555555 | 0 |
| 0.8375 | 0 |
| 0.8381944444444445 | 0 |
| 0.8388888888888889 | 0 |
| 0.8395833333333332 | 0 |
| 0.8402777777777778 | 0 |
| 0.8409722222222222 | 0 |
| 0.8416666666666667 | 0 |
| 0.842361111111111 | 0 |
| 0.8430555555555556 | 0 |
| 0.84375 | 0 |
| 0.8444444444444444 | 0 |
| 0.845138888888889 | 0 |
| 0.8458333333333333 | 0 |
| 0.8465277777777778 | 0 |
| 0.8472222222222222 | 0 |
| 0.8479166666666668 | 0 |
| 0.8486111111111111 | 0 |
| 0.8493055555555555 | 0 |
| 0.85 | 0 |
| 0.8506944444444445 | 0 |
| 0.8513888888888889 | 0 |
| 0.8520833333333333 | 0 |
| 0.8527777777777777 | 0 |
| 0.8534722222222223 | 0 |
| 0.8541666666666666 | 0 |
| 0.8548611111111111 | 0 |
| 0.8555555555555556 | 0 |
| 0.8562500000000001 | 0 |
| 0.8569444444444444 | 0 |
| 0.8576388888888888 | 0 |
| 0.8583333333333334 | 0 |
| 0.8590277777777778 | 0 |
| 0.8597222222222222 | 0 |
| 0.8604166666666666 | 0 |
| 0.8611111111111112 | 0 |
| 0.8618055555555556 | 0 |
| 0.8624999999999999 | 0 |
| 0.8631944444444444 | 0 |
| 0.8638888888888889 | 0 |
| 0.8645833333333334 | 0 |
| 0.8652777777777777 | 0 |
| 0.8659722222222223 | 0 |
| 0.8666666666666667 | 0 |
| 0.8673611111111111 | 0 |
| 0.8680555555555555 | 0 |
| 0.86875 | 0 |
| 0.8694444444444445 | 0 |
| 0.8701388888888889 | 0 |
| 0.8708333333333332 | 0 |
| 0.8715277777777778 | 0 |
| 0.8722222222222222 | 0 |
| 0.8729166666666667 | 0 |
| 0.873611111111111 | 0 |
| 0.8743055555555556 | 0 |
| 0.875 | 0 |
| 0.8756944444444444 | 0 |
| 0.876388888888889 | 0 |
| 0.8770833333333333 | 0 |
| 0.8777777777777778 | 0 |
| 0.8784722222222222 | 0 |
| 0.8791666666666668 | 0 |
| 0.8798611111111111 | 0 |
| 0.8805555555555555 | 0 |
| 0.88125 | 0 |
| 0.8819444444444445 | 0 |
| 0.8826388888888889 | 0 |
| 0.8833333333333333 | 0 |
| 0.8840277777777777 | 0 |
| 0.8847222222222223 | 0 |
| 0.8854166666666666 | 0 |
| 0.8861111111111111 | 0 |
| 0.8868055555555556 | 0 |
| 0.8875000000000001 | 0 |
| 0.8881944444444444 | 0 |
| 0.8888888888888888 | 0 |
| 0.8895833333333334 | 0 |
| 0.8902777777777778 | 0 |
| 0.8909722222222222 | 0 |
| 0.8916666666666666 | 0 |
| 0.8923611111111112 | 0 |
| 0.8930555555555556 | 0 |
| 0.8937499999999999 | 0 |
| 0.8944444444444444 | 0 |
| 0.8951388888888889 | 0 |
| 0.8958333333333334 | 0 |
| 0.8965277777777777 | 0 |
| 0.8972222222222223 | 0 |
| 0.8979166666666667 | 0 |
| 0.8986111111111111 | 0 |
| 0.8993055555555555 | 0 |
| 0.9 | 0 |
| 0.9006944444444445 | 0 |
| 0.9013888888888889 | 0 |
| 0.9020833333333332 | 0 |
| 0.9027777777777778 | 0 |
| 0.9034722222222222 | 0 |
| 0.9041666666666667 | 0 |
| 0.904861111111111 | 0 |
| 0.9055555555555556 | 0 |
| 0.90625 | 0 |
| 0.9069444444444444 | 0 |
| 0.907638888888889 | 0 |
| 0.9083333333333333 | 0 |
| 0.9090277777777778 | 0 |
| 0.9097222222222222 | 0 |
| 0.9104166666666668 | 0 |
| 0.9111111111111111 | 0 |
| 0.9118055555555555 | 0 |
| 0.9125 | 0 |
| 0.9131944444444445 | 0 |
| 0.9138888888888889 | 0 |
| 0.9145833333333333 | 0 |
| 0.9152777777777777 | 0 |
| 0.9159722222222223 | 0 |
| 0.9166666666666666 | 0 |
| 0.9173611111111111 | 0 |
| 0.9180555555555556 | 0 |
| 0.9187500000000001 | 0 |
| 0.9194444444444444 | 0 |
| 0.9201388888888888 | 0 |
| 0.9208333333333334 | 0 |
| 0.9215277777777778 | 0 |
| 0.9222222222222222 | 0 |
| 0.9229166666666666 | 0 |
| 0.9236111111111112 | 0 |
| 0.9243055555555556 | 0 |
| 0.9249999999999999 | 0 |
| 0.9256944444444444 | 0 |
| 0.9263888888888889 | 0 |
| 0.9270833333333334 | 0 |
| 0.9277777777777777 | 0 |
| 0.9284722222222223 | 0 |
| 0.9291666666666667 | 0 |
| 0.9298611111111111 | 0 |
| 0.9305555555555555 | 0 |
| 0.93125 | 0 |
| 0.9319444444444445 | 0 |
| 0.9326388888888889 | 0 |
| 0.9333333333333332 | 0 |
| 0.9340277777777778 | 0 |
| 0.9347222222222222 | 0 |
| 0.9354166666666667 | 0 |
| 0.936111111111111 | 0 |
| 0.9368055555555556 | 0 |
| 0.9375 | 0 |
| 0.9381944444444444 | 0 |
| 0.938888888888889 | 0 |
| 0.9395833333333333 | 0 |
| 0.9402777777777778 | 0 |
| 0.9409722222222222 | 0 |
| 0.9416666666666668 | 0 |
| 0.9423611111111111 | 0 |
| 0.9430555555555555 | 0 |
| 0.94375 | 0 |
| 0.9444444444444445 | 0 |
| 0.9451388888888889 | 0 |
| 0.9458333333333333 | 0 |
| 0.9465277777777777 | 0 |
| 0.9472222222222223 | 0 |
| 0.9479166666666666 | 0 |
| 0.9486111111111111 | 0 |
| 0.9493055555555556 | 0 |
| 0.9500000000000001 | 0 |
| 0.9506944444444444 | 0 |
| 0.9513888888888888 | 0 |
| 0.9520833333333334 | 0 |
| 0.9527777777777778 | 0 |
| 0.9534722222222222 | 0 |
| 0.9541666666666666 | 0 |
| 0.9548611111111112 | 0 |
| 0.9555555555555556 | 0 |
| 0.9562499999999999 | 0 |
| 0.9569444444444444 | 0 |
| 0.9576388888888889 | 0 |
| 0.9583333333333334 | 0 |
| 0.9590277777777777 | 0 |
| 0.9597222222222223 | 0 |
| 0.9604166666666667 | 0 |
| 0.9611111111111111 | 0 |
| 0.9618055555555555 | 0 |
| 0.9625 | 0 |
| 0.9631944444444445 | 0 |
| 0.9638888888888889 | 0 |
| 0.9645833333333332 | 0 |
| 0.9652777777777778 | 0 |
| 0.9659722222222222 | 0 |
| 0.9666666666666667 | 0 |
| 0.967361111111111 | 0 |
| 0.9680555555555556 | 0 |
| 0.96875 | 0 |
| 0.9694444444444444 | 0 |
| 0.970138888888889 | 0 |
| 0.9708333333333333 | 0 |
| 0.9715277777777778 | 0 |
| 0.9722222222222222 | 0 |
| 0.9729166666666668 | 0 |
| 0.9736111111111111 | 0 |
| 0.9743055555555555 | 0 |
| 0.975 | 0 |
| 0.9756944444444445 | 0 |
| 0.9763888888888889 | 0 |
| 0.9770833333333333 | 0 |
| 0.9777777777777777 | 0 |
| 0.9784722222222223 | 0 |
| 0.9791666666666666 | 0 |
| 0.9798611111111111 | 0 |
| 0.9805555555555556 | 0 |
| 0.9812500000000001 | 0 |
| 0.9819444444444444 | 0 |
| 0.9826388888888888 | 0 |
| 0.9833333333333334 | 0 |
| 0.9840277777777778 | 0 |
| 0.9847222222222222 | 0 |
| 0.9854166666666666 | 0 |
| 0.9861111111111112 | 0 |
| 0.9868055555555556 | 0 |
| 0.9874999999999999 | 0 |
| 0.9881944444444444 | 0 |
| 0.9888888888888889 | 0 |
| 0.9895833333333334 | 0 |
| 0.9902777777777777 | 0 |
| 0.9909722222222223 | 0 |
| 0.9916666666666667 | 0 |
| 0.9923611111111111 | 0 |
| 0.9930555555555555 | 0 |
| 0.99375 | 0 |
| 0.9944444444444445 | 0 |
| 0.9951388888888889 | 0 |
| 0.9958333333333332 | 0 |
| 0.9965277777777778 | 0 |
| 0.9972222222222222 | 0 |
| 0.9979166666666667 | 0 |
| 0.998611111111111 | 0 |
| 0.9993055555555556 | 0 |